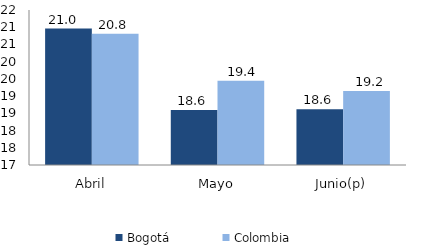
| Category | Bogotá | Colombia |
|---|---|---|
| Abril | 20.96 | 20.81 |
| Mayo | 18.599 | 19.449 |
| Junio(p) | 18.622 | 19.151 |